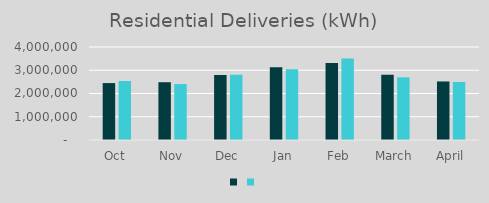
| Category | Series 1 | Series 0 |
|---|---|---|
| Oct | 2448610 | 2538922 |
| Nov | 2484917 | 2405818 |
| Dec | 2793607 | 2803771 |
| Jan | 3124442 | 3040217 |
| Feb | 3307618 | 3510451 |
| March | 2805250 | 2696163 |
| April | 2517652 | 2493703 |